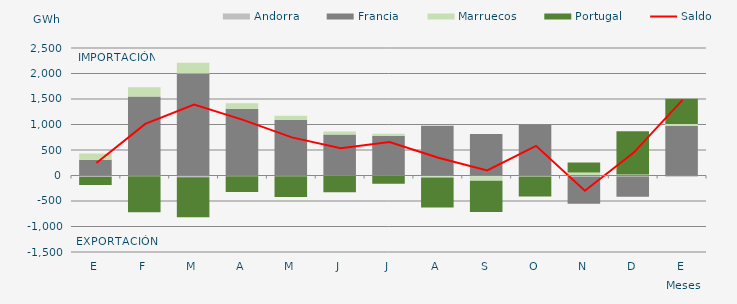
| Category | Andorra | Francia | Marruecos | Portugal |
|---|---|---|---|---|
| E | -26.717 | 310.511 | 121.876 | -159.316 |
| F | -15.973 | 1550.723 | 179.304 | -702.278 |
| M | -32.372 | 2000.98 | 212.165 | -788.594 |
| A | -13.98 | 1308.271 | 106.522 | -309.693 |
| M | -12.717 | 1093.205 | 77.107 | -409.795 |
| J | -8.299 | 804.225 | 59.96 | -319.011 |
| J | -1.488 | 777.149 | 40.929 | -159.488 |
| A | -16.745 | 974.066 | -21.389 | -587.13 |
| S | -21.816 | 812.203 | -79.308 | -613.114 |
| O | -14.818 | 993.522 | -4.279 | -393.484 |
| N | -22.557 | -531.947 | 57.949 | 199.161 |
| D | -20.764 | -396.046 | 21.949 | 843.669 |
| E | -24.438 | 973.605 | 35.757 | 497.454 |